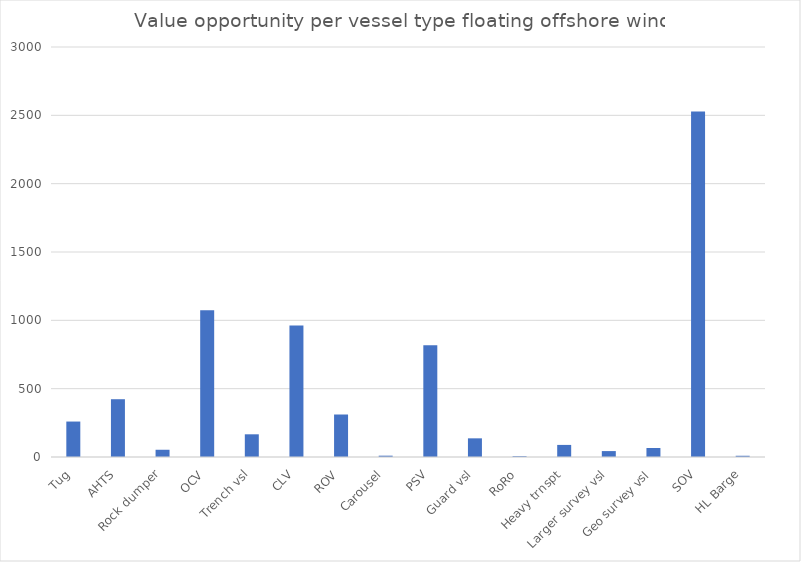
| Category | Series 0 |
|---|---|
| Tug | 259.431 |
| AHTS | 422.767 |
| Rock dumper | 52.945 |
| OCV | 1073.763 |
| Trench vsl | 166.055 |
| CLV | 962.64 |
| ROV | 310.97 |
| Carousel | 9.626 |
| PSV | 818.046 |
| Guard vsl | 136.575 |
| RoRo | 6.016 |
| Heavy trnspt | 88.409 |
| Larger survey vsl | 43.319 |
| Geo survey vsl | 65.7 |
| SOV | 2528.685 |
| HL Barge | 9.025 |